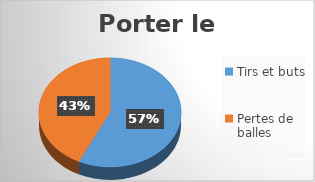
| Category | Series 0 |
|---|---|
| Tirs et buts | 57.143 |
| Pertes de balles | 42.857 |